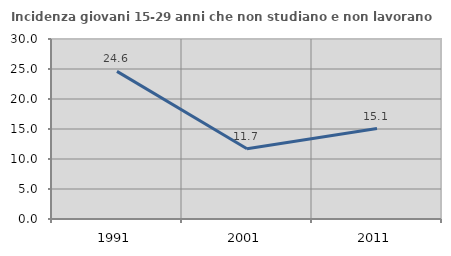
| Category | Incidenza giovani 15-29 anni che non studiano e non lavorano  |
|---|---|
| 1991.0 | 24.607 |
| 2001.0 | 11.704 |
| 2011.0 | 15.078 |